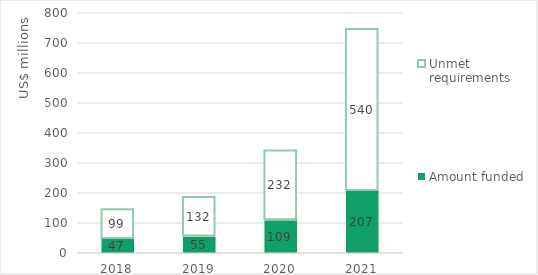
| Category | Amount funded | Unmet requirements |
|---|---|---|
| 2018.0 | 46.697 | 98.869 |
| 2019.0 | 54.685 | 132.026 |
| 2020.0 | 109.346 | 232.17 |
| 2021.0 | 206.966 | 539.989 |